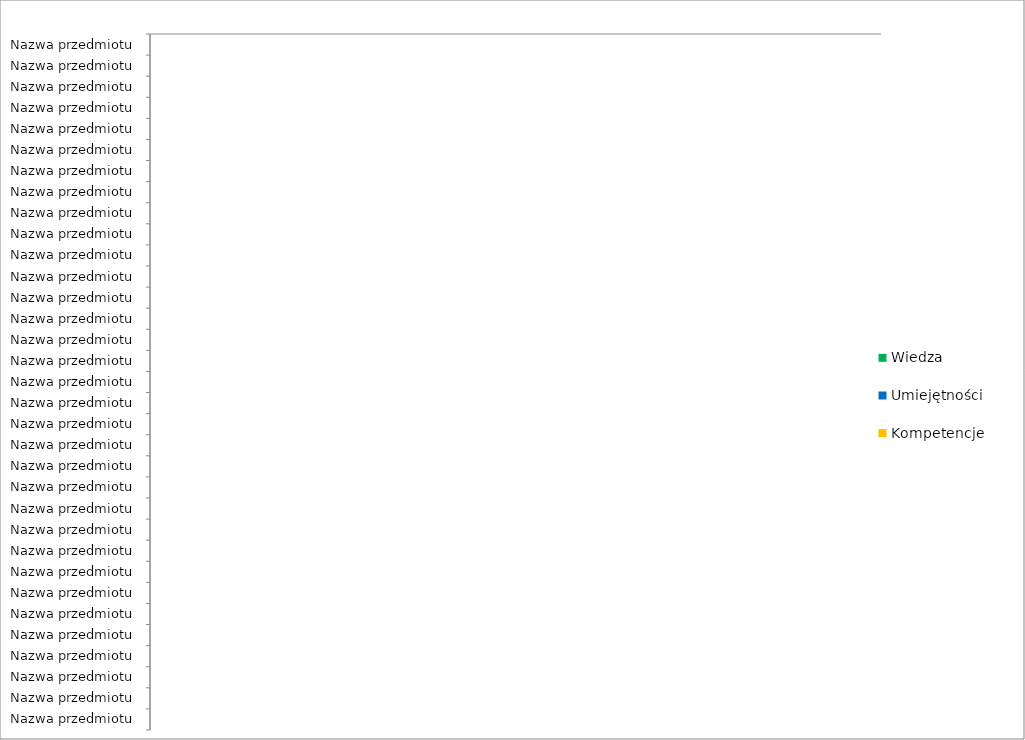
| Category | Wiedza | Umiejętności | Kompetencje |
|---|---|---|---|
| Nazwa przedmiotu | 0 | 0 | 0 |
| Nazwa przedmiotu | 0 | 0 | 0 |
| Nazwa przedmiotu | 0 | 0 | 0 |
| Nazwa przedmiotu | 0 | 0 | 0 |
| Nazwa przedmiotu | 0 | 0 | 0 |
| Nazwa przedmiotu | 0 | 0 | 0 |
| Nazwa przedmiotu | 0 | 0 | 0 |
| Nazwa przedmiotu | 0 | 0 | 0 |
| Nazwa przedmiotu | 0 | 0 | 0 |
| Nazwa przedmiotu | 0 | 0 | 0 |
| Nazwa przedmiotu | 0 | 0 | 0 |
| Nazwa przedmiotu | 0 | 0 | 0 |
| Nazwa przedmiotu | 0 | 0 | 0 |
| Nazwa przedmiotu | 0 | 0 | 0 |
| Nazwa przedmiotu | 0 | 0 | 0 |
| Nazwa przedmiotu | 0 | 0 | 0 |
| Nazwa przedmiotu | 0 | 0 | 0 |
| Nazwa przedmiotu | 0 | 0 | 0 |
| Nazwa przedmiotu | 0 | 0 | 0 |
| Nazwa przedmiotu | 0 | 0 | 0 |
| Nazwa przedmiotu | 0 | 0 | 0 |
| Nazwa przedmiotu | 0 | 0 | 0 |
| Nazwa przedmiotu | 0 | 0 | 0 |
| Nazwa przedmiotu | 0 | 0 | 0 |
| Nazwa przedmiotu | 0 | 0 | 0 |
| Nazwa przedmiotu | 0 | 0 | 0 |
| Nazwa przedmiotu | 0 | 0 | 0 |
| Nazwa przedmiotu | 0 | 0 | 0 |
| Nazwa przedmiotu | 0 | 0 | 0 |
| Nazwa przedmiotu | 0 | 0 | 0 |
| Nazwa przedmiotu | 0 | 0 | 0 |
| Nazwa przedmiotu | 0 | 0 | 0 |
| Nazwa przedmiotu | 0 | 0 | 0 |